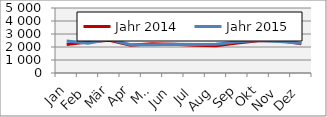
| Category | Jahr 2014 | Jahr 2015 |
|---|---|---|
| Jan | 2196.931 | 2457.689 |
| Feb | 2388.443 | 2280.61 |
| Mär | 2518.672 | 2596.851 |
| Apr | 2128.95 | 2174.126 |
| Mai | 2254.972 | 2170.002 |
| Jun | 2203.898 | 2211.868 |
| Jul | 2140.145 | 2196.061 |
| Aug | 2092.689 | 2209.812 |
| Sep | 2315.632 | 2408.587 |
| Okt | 2473.194 | 2501.634 |
| Nov | 2492.779 | 2420.21 |
| Dez | 2242.497 | 2293.388 |